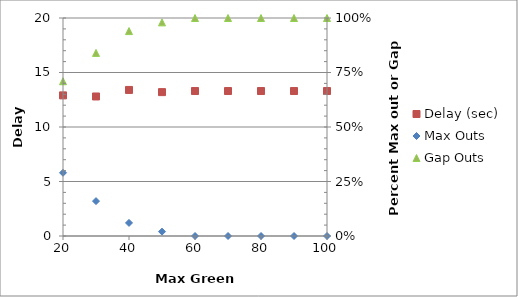
| Category | Delay (sec) |
|---|---|
| 100.0 | 13.3 |
| 90.0 | 13.3 |
| 80.0 | 13.3 |
| 70.0 | 13.3 |
| 60.0 | 13.3 |
| 50.0 | 13.2 |
| 40.0 | 13.4 |
| 30.0 | 12.8 |
| 20.0 | 12.9 |